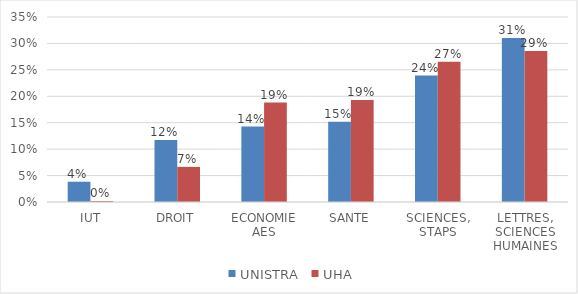
| Category | UNISTRA | UHA |
|---|---|---|
|  IUT | 0.038 | 0.002 |
| DROIT | 0.117 | 0.066 |
| ECONOMIE AES | 0.143 | 0.188 |
| SANTE | 0.152 | 0.193 |
| SCIENCES, STAPS | 0.239 | 0.265 |
| LETTRES, SCIENCES HUMAINES | 0.31 | 0.286 |